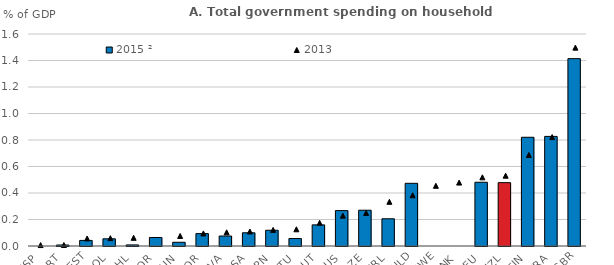
| Category | 2015 ² |
|---|---|
| ESP | 0 |
| PRT | 0.007 |
| EST | 0.042 |
| POL | 0.054 |
| CHL | 0.008 |
| KOR | 0.064 |
| HUN | 0.028 |
| NOR | 0.094 |
| LVA | 0.075 |
| USA | 0.1 |
| JPN | 0.119 |
| LTU | 0.056 |
| AUT | 0.159 |
| AUS | 0.267 |
| CZE | 0.27 |
| IRL | 0.206 |
| NLD | 0.473 |
| SWE | 0 |
| DNK | 0 |
| DEU | 0.481 |
| NZL | 0.478 |
| FIN | 0.821 |
| FRA | 0.827 |
| GBR | 1.414 |